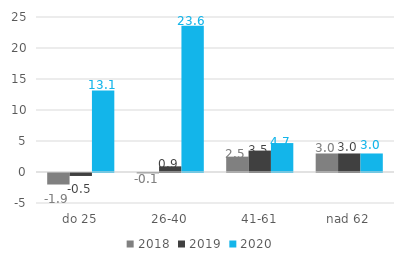
| Category | 2018 | 2019 | 2020 |
|---|---|---|---|
| do 25 | -1.857 | -0.479 | 13.142 |
| 26-40 | -0.062 | 0.913 | 23.577 |
| 41-61 | 2.477 | 3.454 | 4.667 |
| nad 62 | 2.988 | 2.988 | 2.988 |